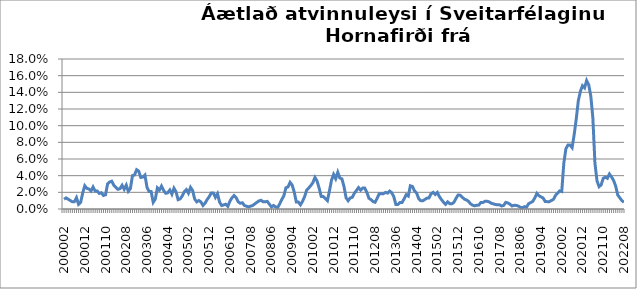
| Category | Series 0 |
|---|---|
| 200002 | 0.012 |
| 200003 | 0.013 |
| 200004 | 0.012 |
| 200005 | 0.01 |
| 200006 | 0.009 |
| 200007 | 0.009 |
| 200008 | 0.014 |
| 200009 | 0.006 |
| 200010 | 0.008 |
| 200011 | 0.019 |
| 200012 | 0.028 |
| 200101 | 0.025 |
| 200102 | 0.024 |
| 200103 | 0.022 |
| 200104 | 0.026 |
| 200105 | 0.022 |
| 200106 | 0.022 |
| 200107 | 0.019 |
| 200108 | 0.019 |
| 200109 | 0.016 |
| 200110 | 0.017 |
| 200111 | 0.03 |
| 200112 | 0.032 |
| 200201 | 0.033 |
| 200202 | 0.028 |
| 200203 | 0.026 |
| 200204 | 0.024 |
| 200205 | 0.024 |
| 200206 | 0.028 |
| 200207 | 0.024 |
| 200208 | 0.029 |
| 200209 | 0.021 |
| 200210 | 0.025 |
| 200211 | 0.04 |
| 200212 | 0.041 |
| 200301 | 0.047 |
| 200302 | 0.045 |
| 200303 | 0.038 |
| 200304 | 0.038 |
| 200305 | 0.041 |
| 200306 | 0.026 |
| 200307 | 0.021 |
| 200308 | 0.021 |
| 200309 | 0.008 |
| 200310 | 0.012 |
| 200311 | 0.025 |
| 200312 | 0.023 |
| 200401 | 0.027 |
| 200402 | 0.022 |
| 200403 | 0.019 |
| 200404 | 0.019 |
| 200405 | 0.023 |
| 200406 | 0.018 |
| 200407 | 0.025 |
| 200408 | 0.021 |
| 200409 | 0.011 |
| 200410 | 0.012 |
| 200411 | 0.016 |
| 200412 | 0.021 |
| 200501 | 0.023 |
| 200502 | 0.019 |
| 200503 | 0.026 |
| 200504 | 0.022 |
| 200505 | 0.012 |
| 200506 | 0.009 |
| 200507 | 0.01 |
| 200508 | 0.008 |
| 200509 | 0.004 |
| 200510 | 0.007 |
| 200511 | 0.011 |
| 200512 | 0.015 |
| 200601 | 0.019 |
| 200602 | 0.019 |
| 200603 | 0.014 |
| 200604 | 0.018 |
| 200605 | 0.008 |
| 200606 | 0.004 |
| 200607 | 0.005 |
| 200608 | 0.006 |
| 200609 | 0.003 |
| 200610 | 0.009 |
| 200611 | 0.014 |
| 200612 | 0.016 |
| 200701 | 0.014 |
| 200702 | 0.009 |
| 200703 | 0.007 |
| 200704 | 0.007 |
| 200705 | 0.004 |
| 200706 | 0.003 |
| 200707 | 0.003 |
| 200708 | 0.003 |
| 200709 | 0.004 |
| 200710 | 0.006 |
| 200711 | 0.008 |
| 200712 | 0.01 |
| 200801 | 0.01 |
| 200802 | 0.009 |
| 200803 | 0.009 |
| 200804 | 0.009 |
| 200805 | 0.006 |
| 200806 | 0.002 |
| 200807 | 0.004 |
| 200808 | 0.003 |
| 200809 | 0.002 |
| 200810 | 0.006 |
| 200811 | 0.011 |
| 200812 | 0.016 |
| 200901 | 0.026 |
| 200902 | 0.026 |
| 200903 | 0.032 |
| 200904 | 0.029 |
| 200905 | 0.02 |
| 200906 | 0.008 |
| 200907 | 0.008 |
| 200908 | 0.005 |
| 200909 | 0.009 |
| 200910 | 0.015 |
| 200911 | 0.023 |
| 200912 | 0.025 |
| 201001 | 0.028 |
| 201002 | 0.032 |
| 201003 | 0.038 |
| 201004 | 0.034 |
| 201005 | 0.025 |
| 201006 | 0.015 |
| 201007 | 0.015 |
| 201008 | 0.012 |
| 201009 | 0.01 |
| 201010 | 0.022 |
| 201011 | 0.035 |
| 201012 | 0.042 |
| 201101 | 0.036 |
| 201102 | 0.044 |
| 201103 | 0.037 |
| 201104 | 0.036 |
| 201105 | 0.027 |
| 201106 | 0.013 |
| 201107 | 0.01 |
| 201108 | 0.013 |
| 201109 | 0.014 |
| 201110 | 0.019 |
| 201111 | 0.022 |
| 201112 | 0.026 |
| 201201 | 0.023 |
| 201202 | 0.025 |
| 201203 | 0.025 |
| 201204 | 0.02 |
| 201205 | 0.013 |
| 201206 | 0.011 |
| 201207 | 0.009 |
| 201208 | 0.008 |
| 201209 | 0.013 |
| 201210 | 0.018 |
| 201211 | 0.018 |
| 201212 | 0.018 |
| 201301 | 0.02 |
| 201302 | 0.019 |
| 201303 | 0.022 |
| 201304 | 0.02 |
| 201305 | 0.015 |
| 201306 | 0.005 |
| 201307 | 0.005 |
| 201308 | 0.008 |
| 201309 | 0.008 |
| 201310 | 0.012 |
| 201311 | 0.017 |
| 201312 | 0.016 |
| 201401* | 0.028 |
| 201402 | 0.027 |
| 201403 | 0.022 |
| 201404 | 0.019 |
| 201405 | 0.013 |
| 201406 | 0.01 |
| 201407 | 0.01 |
| 201408 | 0.011 |
| 201409 | 0.013 |
| 201410 | 0.013 |
| 201411 | 0.018 |
| 201412 | 0.02 |
| 201501 | 0.017 |
| 201502 | 0.02 |
| 201503 | 0.015 |
| 201504 | 0.011 |
| 201505 | 0.008 |
| 201506 | 0.006 |
| 201507 | 0.009 |
| 201508 | 0.006 |
| 201509 | 0.006 |
| 201510 | 0.008 |
| 201511 | 0.013 |
| 201512 | 0.017 |
| 201601 | 0.017 |
| 201602 | 0.014 |
| 201603 | 0.012 |
| 201604 | 0.011 |
| 201605 | 0.009 |
| 201606 | 0.006 |
| 201607 | 0.005 |
| 201608 | 0.004 |
| 201609 | 0.005 |
| 201610 | 0.005 |
| 201611 | 0.008 |
| 201612 | 0.008 |
| 201701 | 0.009 |
| 201702 | 0.009 |
| 201703 | 0.009 |
| 201704 | 0.007 |
| 201705 | 0.006 |
| 201706 | 0.005 |
| 201707 | 0.005 |
| 201708 | 0.005 |
| 201709 | 0.004 |
| 201710 | 0.004 |
| 201711 | 0.008 |
| 201712 | 0.007 |
| 201801 | 0.006 |
| 201802 | 0.004 |
| 201803 | 0.004 |
| 201804 | 0.004 |
| 201805 | 0.004 |
| 201806 | 0.002 |
| 201807 | 0.001 |
| 201808 | 0.003 |
| 201809 | 0.002 |
| 201810 | 0.006 |
| 201811 | 0.008 |
| 201812 | 0.009 |
| 201901 | 0.013 |
| 201902 | 0.019 |
| 201903 | 0.016 |
| 201904 | 0.015 |
| 201905 | 0.013 |
| 201906 | 0.009 |
| 201907 | 0.009 |
| 201908 | 0.009 |
| 201909 | 0.01 |
| 201910 | 0.012 |
| 201911 | 0.016 |
| 201912 | 0.019 |
| 202001 | 0.022 |
| 202002 | 0.021 |
| 202003***  | 0.055 |
| 202004 | 0.072 |
| 202005 | 0.077 |
| 202006 | 0.077 |
| 202007 | 0.074 |
| 202008 | 0.089 |
| 202009 | 0.108 |
| 202010 | 0.13 |
| 202011 | 0.141 |
| 202012 | 0.148 |
| 202101 | 0.145 |
| 202102 | 0.154 |
| 202103 | 0.149 |
| 202104 | 0.136 |
| 202105 | 0.109 |
| 202106 | 0.055 |
| 202107 | 0.034 |
| 202108 | 0.027 |
| 202109 | 0.029 |
| 202110 | 0.037 |
| 202111 | 0.038 |
| 202112 | 0.037 |
| 202201 | 0.042 |
| 202202 | 0.038 |
| 202203 | 0.034 |
| 202204 | 0.028 |
| 202205 | 0.017 |
| 202206 | 0.013 |
| 202207 | 0.01 |
| 202208 | 0.008 |